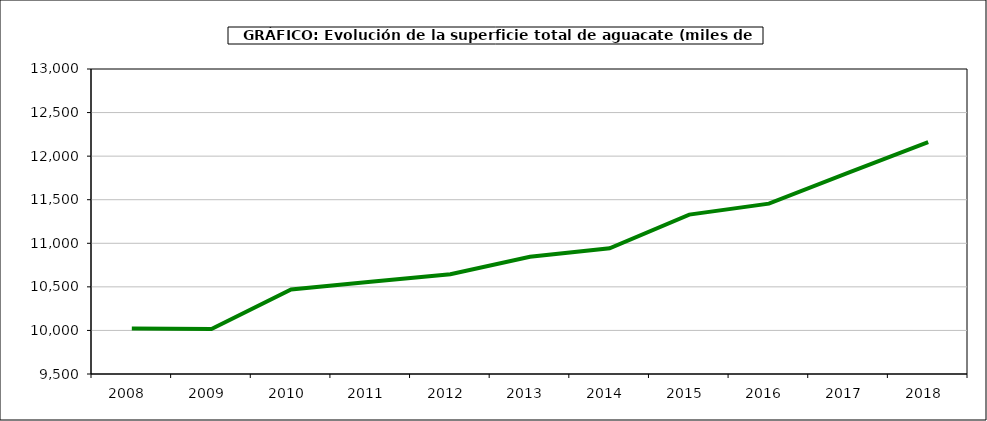
| Category | superficie aguacate |
|---|---|
| 2008.0 | 10023 |
| 2009.0 | 10016 |
| 2010.0 | 10470 |
| 2011.0 | 10558 |
| 2012.0 | 10645 |
| 2013.0 | 10845 |
| 2014.0 | 10943 |
| 2015.0 | 11329 |
| 2016.0 | 11455 |
| 2017.0 | 11812 |
| 2018.0 | 12161 |